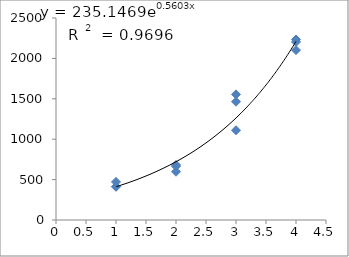
| Category | Series 0 |
|---|---|
| 1.0 | 471.341 |
| 1.0 | 410.933 |
| 1.0 | 414.907 |
| 2.0 | 681.437 |
| 2.0 | 597.507 |
| 2.0 | 665.45 |
| 3.0 | 1110.601 |
| 3.0 | 1554.842 |
| 3.0 | 1463.974 |
| 4.0 | 2233.612 |
| 4.0 | 2102.763 |
| 4.0 | 2203.77 |